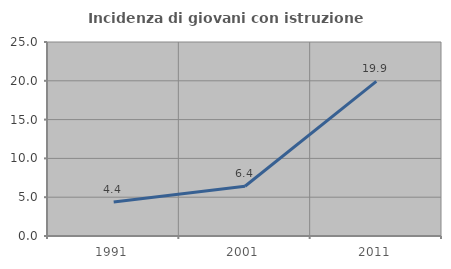
| Category | Incidenza di giovani con istruzione universitaria |
|---|---|
| 1991.0 | 4.37 |
| 2001.0 | 6.415 |
| 2011.0 | 19.935 |